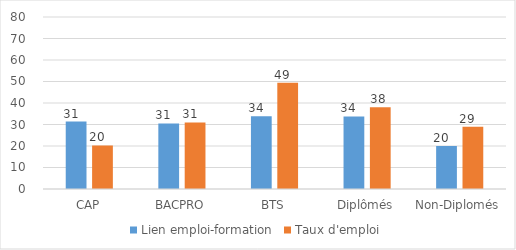
| Category | Lien emploi-formation | Taux d'emploi |
|---|---|---|
| CAP | 31.36 | 20.26 |
| BACPRO | 30.52 | 30.94 |
| BTS | 33.89 | 49.4 |
| Diplômés | 33.74 | 38 |
| Non-Diplomés | 19.98 | 29 |